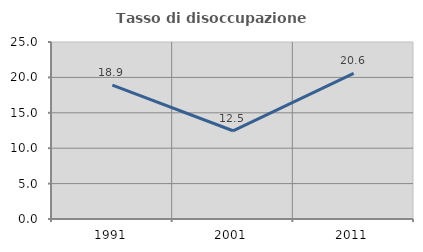
| Category | Tasso di disoccupazione giovanile  |
|---|---|
| 1991.0 | 18.922 |
| 2001.0 | 12.461 |
| 2011.0 | 20.561 |